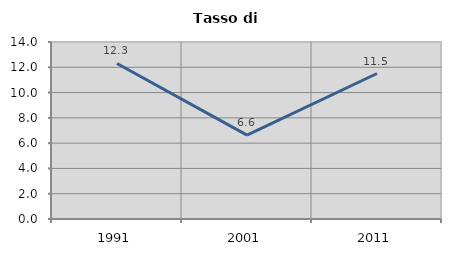
| Category | Tasso di disoccupazione   |
|---|---|
| 1991.0 | 12.299 |
| 2001.0 | 6.633 |
| 2011.0 | 11.508 |